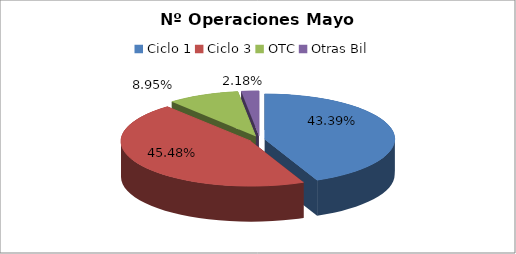
| Category | Series 0 |
|---|---|
| Ciclo 1 | 43118 |
| Ciclo 3 | 45196 |
| OTC | 8896 |
| Otras Bil | 2164 |